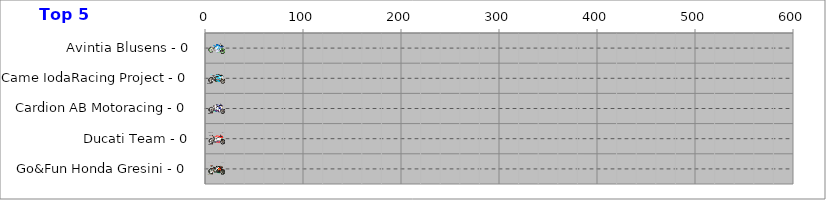
| Category | Avintia Blusens | Came IodaRacing Project | Cardion AB Motoracing | Ducati Team | Go&Fun Honda Gresini | LCR Honda MotoGP | Monster Yamaha Tech 3 | NGM Mobile Forward Racing | Paul Bird Motorsport | Power Electronics Aspar | Pramac Racing Team | Repsol Honda Team | Yamaha Factory Racing | Series 13 | Series 27 |
|---|---|---|---|---|---|---|---|---|---|---|---|---|---|---|---|
| Avintia Blusens - 0 | 24 | 0 | 0 | 0 | 0 | 0 | 0 | 0 | 0 | 0 | 0 | 0 | 0 | 0 | 0 |
| Came IodaRacing Project - 0 | 0 | 24 | 0 | 0 | 0 | 0 | 0 | 0 | 0 | 0 | 0 | 0 | 0 | 0 | 0 |
| Cardion AB Motoracing - 0 | 0 | 0 | 24 | 0 | 0 | 0 | 0 | 0 | 0 | 0 | 0 | 0 | 0 | 0 | 0 |
| Ducati Team - 0 | 0 | 0 | 0 | 24 | 0 | 0 | 0 | 0 | 0 | 0 | 0 | 0 | 0 | 0 | 0 |
| Go&Fun Honda Gresini - 0 | 0 | 0 | 0 | 0 | 24 | 0 | 0 | 0 | 0 | 0 | 0 | 0 | 0 | 0 | 0 |